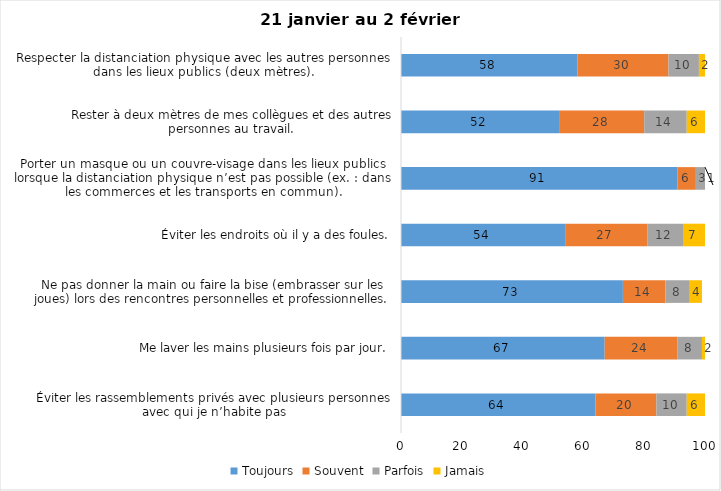
| Category | Toujours | Souvent | Parfois | Jamais |
|---|---|---|---|---|
| Éviter les rassemblements privés avec plusieurs personnes avec qui je n’habite pas | 64 | 20 | 10 | 6 |
| Me laver les mains plusieurs fois par jour. | 67 | 24 | 8 | 2 |
| Ne pas donner la main ou faire la bise (embrasser sur les joues) lors des rencontres personnelles et professionnelles. | 73 | 14 | 8 | 4 |
| Éviter les endroits où il y a des foules. | 54 | 27 | 12 | 7 |
| Porter un masque ou un couvre-visage dans les lieux publics lorsque la distanciation physique n’est pas possible (ex. : dans les commerces et les transports en commun). | 91 | 6 | 3 | 1 |
| Rester à deux mètres de mes collègues et des autres personnes au travail. | 52 | 28 | 14 | 6 |
| Respecter la distanciation physique avec les autres personnes dans les lieux publics (deux mètres). | 58 | 30 | 10 | 2 |